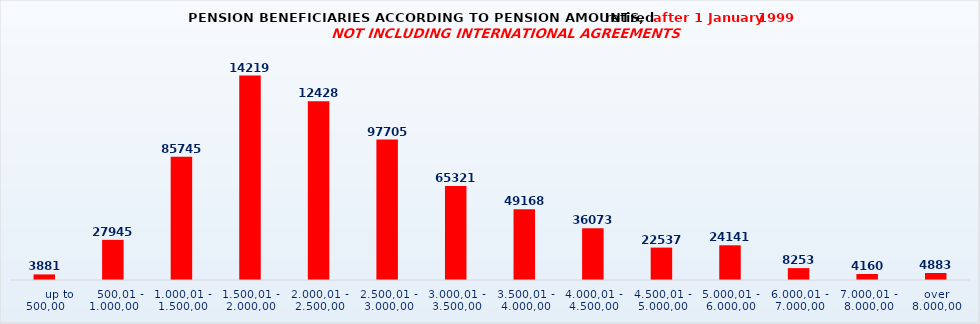
| Category | Series 0 |
|---|---|
|       up to 500,00 | 3881 |
|    500,01 - 1.000,00 | 27945 |
| 1.000,01 - 1.500,00 | 85745 |
| 1.500,01 - 2.000,00 | 142195 |
| 2.000,01 - 2.500,00 | 124281 |
| 2.500,01 - 3.000,00 | 97705 |
| 3.000,01 - 3.500,00 | 65321 |
| 3.500,01 - 4.000,00 | 49168 |
| 4.000,01 - 4.500,00 | 36073 |
| 4.500,01 - 5.000,00 | 22537 |
| 5.000,01 - 6.000,00 | 24141 |
| 6.000,01 - 7.000,00 | 8253 |
| 7.000,01 - 8.000,00 | 4160 |
| over 8.000,00 | 4883 |